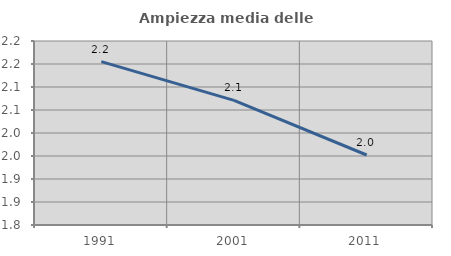
| Category | Ampiezza media delle famiglie |
|---|---|
| 1991.0 | 2.155 |
| 2001.0 | 2.071 |
| 2011.0 | 1.952 |